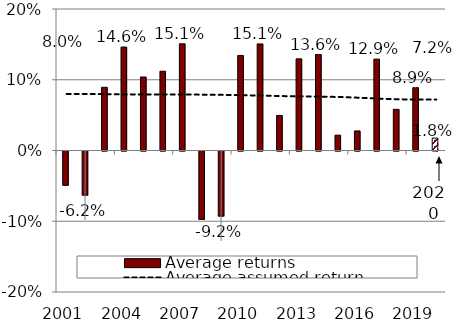
| Category | Average returns |
|---|---|
| 2001.0 | -0.048 |
| 2002.0 | -0.062 |
| 2003.0 | 0.089 |
| 2004.0 | 0.146 |
| 2005.0 | 0.104 |
| 2006.0 | 0.112 |
| 2007.0 | 0.151 |
| 2008.0 | -0.097 |
| 2009.0 | -0.092 |
| 2010.0 | 0.134 |
| 2011.0 | 0.151 |
| 2012.0 | 0.05 |
| 2013.0 | 0.13 |
| 2014.0 | 0.136 |
| 2015.0 | 0.022 |
| 2016.0 | 0.028 |
| 2017.0 | 0.129 |
| 2018.0 | 0.058 |
| 2019.0 | 0.089 |
| 2020.0 | 0.018 |